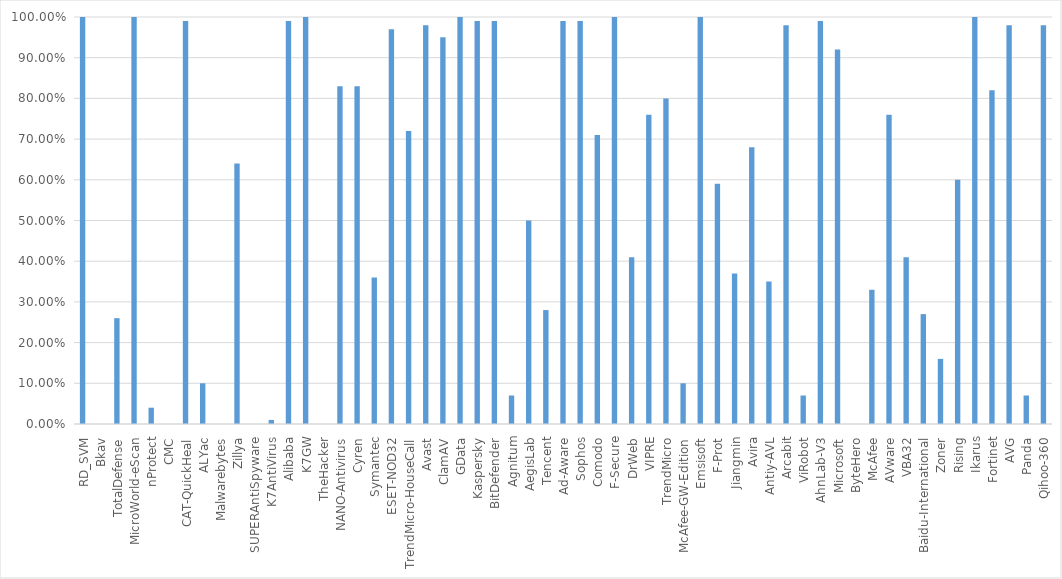
| Category | Series 0 |
|---|---|
| RD_SVM | 1 |
| Bkav | 0 |
| TotalDefense | 0.26 |
| MicroWorld-eScan | 1 |
| nProtect | 0.04 |
| CMC | 0 |
| CAT-QuickHeal | 0.99 |
| ALYac | 0.1 |
| Malwarebytes | 0 |
| Zillya | 0.64 |
| SUPERAntiSpyware | 0 |
| K7AntiVirus | 0.01 |
| Alibaba | 0.99 |
| K7GW | 1 |
| TheHacker | 0 |
| NANO-Antivirus | 0.83 |
| Cyren | 0.83 |
| Symantec | 0.36 |
| ESET-NOD32 | 0.97 |
| TrendMicro-HouseCall | 0.72 |
| Avast | 0.98 |
| ClamAV | 0.95 |
| GData | 1 |
| Kaspersky | 0.99 |
| BitDefender | 0.99 |
| Agnitum | 0.07 |
| AegisLab | 0.5 |
| Tencent | 0.28 |
| Ad-Aware | 0.99 |
| Sophos | 0.99 |
| Comodo | 0.71 |
| F-Secure | 1 |
| DrWeb | 0.41 |
| VIPRE | 0.76 |
| TrendMicro | 0.8 |
| McAfee-GW-Edition | 0.1 |
| Emsisoft | 1 |
| F-Prot | 0.59 |
| Jiangmin | 0.37 |
| Avira | 0.68 |
| Antiy-AVL | 0.35 |
| Arcabit | 0.98 |
| ViRobot | 0.07 |
| AhnLab-V3 | 0.99 |
| Microsoft | 0.92 |
| ByteHero | 0 |
| McAfee | 0.33 |
| AVware | 0.76 |
| VBA32 | 0.41 |
| Baidu-International | 0.27 |
| Zoner | 0.16 |
| Rising | 0.6 |
| Ikarus | 1 |
| Fortinet | 0.82 |
| AVG | 0.98 |
| Panda | 0.07 |
| Qihoo-360 | 0.98 |